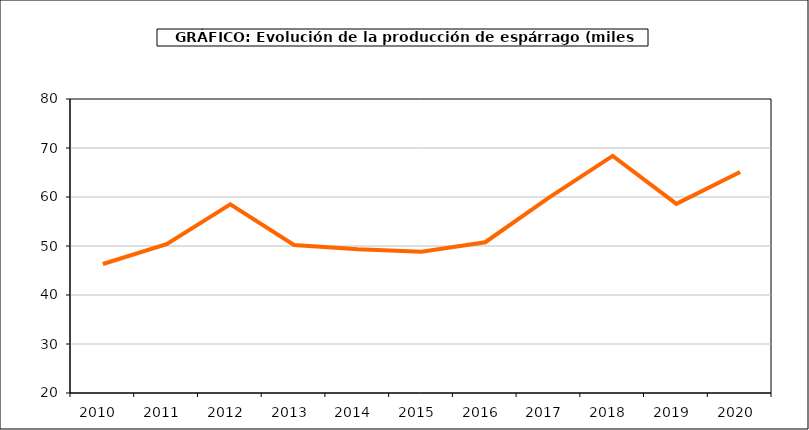
| Category | producción |
|---|---|
| 2010.0 | 46.324 |
| 2011.0 | 50.362 |
| 2012.0 | 58.496 |
| 2013.0 | 50.212 |
| 2014.0 | 49.352 |
| 2015.0 | 48.814 |
| 2016.0 | 50.771 |
| 2017.0 | 59.869 |
| 2018.0 | 68.403 |
| 2019.0 | 58.605 |
| 2020.0 | 65.094 |